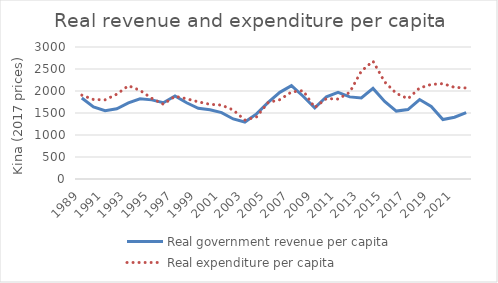
| Category | Real government revenue per capita | Real expenditure per capita |
|---|---|---|
| 1989.0 | 1842.109 | 1906.062 |
| 1990.0 | 1640.271 | 1806.471 |
| 1991.0 | 1554.348 | 1799.117 |
| 1992.0 | 1596.916 | 1927.224 |
| 1993.0 | 1728.537 | 2120.023 |
| 1994.0 | 1821.312 | 2014.27 |
| 1995.0 | 1798.568 | 1833.461 |
| 1996.0 | 1733.456 | 1699.75 |
| 1997.0 | 1887.909 | 1879.678 |
| 1998.0 | 1733.101 | 1823.185 |
| 1999.0 | 1607.72 | 1753.097 |
| 2000.0 | 1574.835 | 1696.766 |
| 2001.0 | 1509.395 | 1679.728 |
| 2002.0 | 1364.879 | 1567.551 |
| 2003.0 | 1294.948 | 1339.046 |
| 2004.0 | 1479.969 | 1411.306 |
| 2005.0 | 1741.466 | 1738.949 |
| 2006.0 | 1969.56 | 1802.362 |
| 2007.0 | 2121.908 | 1978.145 |
| 2008.0 | 1880.934 | 2008.176 |
| 2009.0 | 1615.317 | 1624.036 |
| 2010.0 | 1869.623 | 1827.551 |
| 2011.0 | 1968.435 | 1816.945 |
| 2012.0 | 1866.407 | 1970.32 |
| 2013.0 | 1841.698 | 2451.715 |
| 2014.0 | 2058.138 | 2678.479 |
| 2015.0 | 1763.358 | 2206.59 |
| 2016.0 | 1543.668 | 1946.019 |
| 2017.0 | 1578.069 | 1823.807 |
| 2018.0 | 1806.002 | 2068.739 |
| 2019.0 | 1647.688 | 2150.166 |
| 2020.0 | 1350.96 | 2166.957 |
| 2021.0 | 1403.604 | 2082.368 |
| 2022.0 | 1510.696 | 2069.114 |